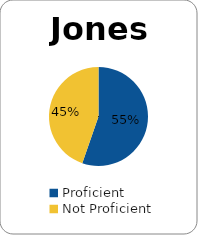
| Category | Series 0 |
|---|---|
| Proficient | 0.553 |
| Not Proficient | 0.447 |